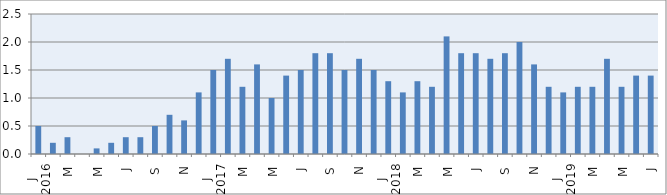
| Category | Series 0 |
|---|---|
| 0 | 0.5 |
| 1 | 0.2 |
| 2 | 0.3 |
| 3 | 0 |
| 4 | 0.1 |
| 5 | 0.2 |
| 6 | 0.3 |
| 7 | 0.3 |
| 8 | 0.5 |
| 9 | 0.7 |
| 10 | 0.6 |
| 11 | 1.1 |
| 12 | 1.5 |
| 13 | 1.7 |
| 14 | 1.2 |
| 15 | 1.6 |
| 16 | 1 |
| 17 | 1.4 |
| 18 | 1.5 |
| 19 | 1.8 |
| 20 | 1.8 |
| 21 | 1.5 |
| 22 | 1.7 |
| 23 | 1.5 |
| 24 | 1.3 |
| 25 | 1.1 |
| 26 | 1.3 |
| 27 | 1.2 |
| 28 | 2.1 |
| 29 | 1.8 |
| 30 | 1.8 |
| 31 | 1.7 |
| 32 | 1.8 |
| 33 | 2 |
| 34 | 1.6 |
| 35 | 1.2 |
| 36 | 1.1 |
| 37 | 1.2 |
| 38 | 1.2 |
| 39 | 1.7 |
| 40 | 1.2 |
| 41 | 1.4 |
| 42 | 1.4 |